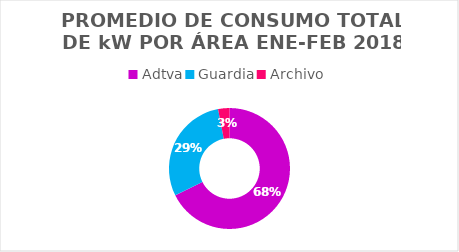
| Category | Series 0 |
|---|---|
| Adtva | 67 |
| Guardia | 29 |
| Archivo | 3 |